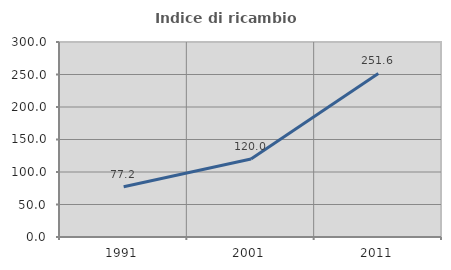
| Category | Indice di ricambio occupazionale  |
|---|---|
| 1991.0 | 77.246 |
| 2001.0 | 120 |
| 2011.0 | 251.579 |